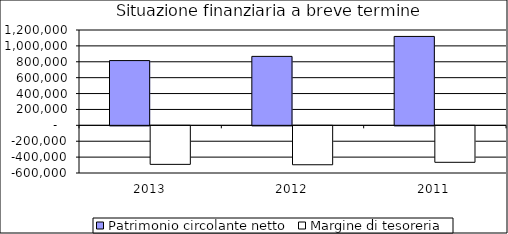
| Category | Patrimonio circolante netto | Margine di tesoreria |
|---|---|---|
| 2013.0 | 815000 | -485000 |
| 2012.0 | 868000 | -490000 |
| 2011.0 | 1119000 | -459000 |